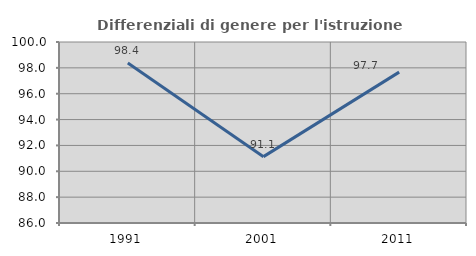
| Category | Differenziali di genere per l'istruzione superiore |
|---|---|
| 1991.0 | 98.369 |
| 2001.0 | 91.133 |
| 2011.0 | 97.671 |